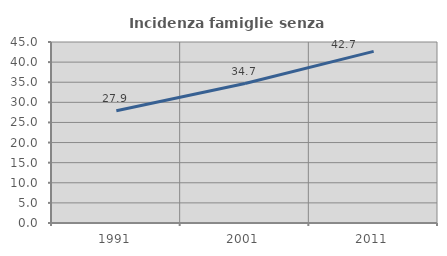
| Category | Incidenza famiglie senza nuclei |
|---|---|
| 1991.0 | 27.885 |
| 2001.0 | 34.669 |
| 2011.0 | 42.675 |